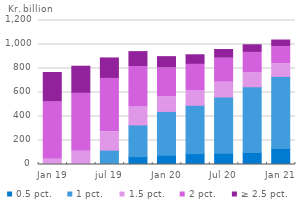
| Category | 0.5 pct. | 1 pct. | 1.5 pct. | 2 pct. | ≥ 2.5 pct. |
|---|---|---|---|---|---|
| Jan 19 | 0 | 0 | 43.561 | 478.438 | 244.868 |
| Apr 19 | 0 | 0.685 | 110.149 | 482.158 | 226.036 |
| jul 19 | 0 | 119.705 | 152.803 | 444.471 | 171.067 |
| Oct 19 | 65.685 | 263.622 | 149.275 | 337.322 | 124.779 |
| Jan 20 | 76.444 | 365.887 | 123.075 | 239.198 | 94.277 |
| Apr 20 | 90.721 | 402.386 | 123.67 | 217.283 | 80.264 |
| Jul 20 | 94.413 | 468.174 | 122.975 | 200.059 | 72.615 |
| Oct 20 | 99.695 | 548.046 | 116.721 | 169.425 | 63.775 |
| Jan 21 | 132.66 | 601.59 | 106.846 | 141.105 | 55.12 |